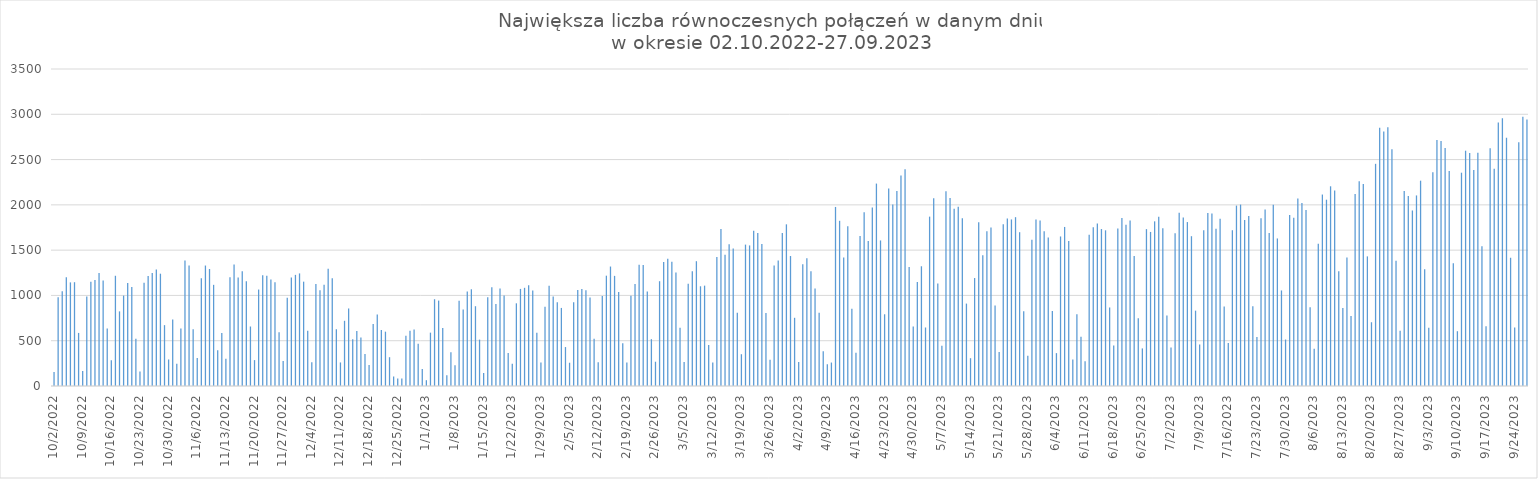
| Category | Max liczba połączeń |
|---|---|
| 10/2/22 | 155 |
| 10/3/22 | 980 |
| 10/4/22 | 1045 |
| 10/5/22 | 1201 |
| 10/6/22 | 1144 |
| 10/7/22 | 1146 |
| 10/8/22 | 586 |
| 10/9/22 | 166 |
| 10/10/22 | 988 |
| 10/11/22 | 1151 |
| 10/12/22 | 1169 |
| 10/13/22 | 1249 |
| 10/14/22 | 1166 |
| 10/15/22 | 634 |
| 10/16/22 | 284 |
| 10/17/22 | 1217 |
| 10/18/22 | 824 |
| 10/19/22 | 998 |
| 10/20/22 | 1138 |
| 10/21/22 | 1093 |
| 10/22/22 | 523 |
| 10/23/22 | 161 |
| 10/24/22 | 1141 |
| 10/25/22 | 1214 |
| 10/26/22 | 1249 |
| 10/27/22 | 1285 |
| 10/28/22 | 1240 |
| 10/29/22 | 672 |
| 10/30/22 | 293 |
| 10/31/22 | 735 |
| 11/1/22 | 247 |
| 11/2/22 | 634 |
| 11/3/22 | 1387 |
| 11/4/22 | 1331 |
| 11/5/22 | 626 |
| 11/6/22 | 309 |
| 11/7/22 | 1189 |
| 11/8/22 | 1330 |
| 11/9/22 | 1292 |
| 11/10/22 | 1117 |
| 11/11/22 | 394 |
| 11/12/22 | 586 |
| 11/13/22 | 301 |
| 11/14/22 | 1201 |
| 11/15/22 | 1342 |
| 11/16/22 | 1199 |
| 11/17/22 | 1266 |
| 11/18/22 | 1157 |
| 11/19/22 | 657 |
| 11/20/22 | 286 |
| 11/21/22 | 1065 |
| 11/22/22 | 1224 |
| 11/23/22 | 1217 |
| 11/24/22 | 1176 |
| 11/25/22 | 1145 |
| 11/26/22 | 593 |
| 11/27/22 | 275 |
| 11/28/22 | 973 |
| 11/29/22 | 1198 |
| 11/30/22 | 1227 |
| 12/1/22 | 1243 |
| 12/2/22 | 1152 |
| 12/3/22 | 610 |
| 12/4/22 | 262 |
| 12/5/22 | 1125 |
| 12/6/22 | 1056 |
| 12/7/22 | 1118 |
| 12/8/22 | 1295 |
| 12/9/22 | 1189 |
| 12/10/22 | 626 |
| 12/11/22 | 260 |
| 12/12/22 | 720 |
| 12/13/22 | 856 |
| 12/14/22 | 516 |
| 12/15/22 | 608 |
| 12/16/22 | 535 |
| 12/17/22 | 354 |
| 12/18/22 | 231 |
| 12/19/22 | 685 |
| 12/20/22 | 790 |
| 12/21/22 | 619 |
| 12/22/22 | 600 |
| 12/23/22 | 318 |
| 12/24/22 | 105 |
| 12/25/22 | 82 |
| 12/26/22 | 84 |
| 12/27/22 | 556 |
| 12/28/22 | 611 |
| 12/29/22 | 624 |
| 12/30/22 | 466 |
| 12/31/22 | 189 |
| 1/1/23 | 64 |
| 1/2/23 | 589 |
| 1/3/23 | 958 |
| 1/4/23 | 943 |
| 1/5/23 | 641 |
| 1/6/23 | 119 |
| 1/7/23 | 374 |
| 1/8/23 | 230 |
| 1/9/23 | 942 |
| 1/10/23 | 845 |
| 1/11/23 | 1043 |
| 1/12/23 | 1068 |
| 1/13/23 | 881 |
| 1/14/23 | 512 |
| 1/15/23 | 144 |
| 1/16/23 | 981 |
| 1/17/23 | 1091 |
| 1/18/23 | 904 |
| 1/19/23 | 1077 |
| 1/20/23 | 998 |
| 1/21/23 | 363 |
| 1/22/23 | 247 |
| 1/23/23 | 913 |
| 1/24/23 | 1072 |
| 1/25/23 | 1084 |
| 1/26/23 | 1112 |
| 1/27/23 | 1054 |
| 1/28/23 | 589 |
| 1/29/23 | 259 |
| 1/30/23 | 874 |
| 1/31/23 | 1108 |
| 2/1/23 | 989 |
| 2/2/23 | 926 |
| 2/3/23 | 862 |
| 2/4/23 | 430 |
| 2/5/23 | 257 |
| 2/6/23 | 925 |
| 2/7/23 | 1059 |
| 2/8/23 | 1070 |
| 2/9/23 | 1057 |
| 2/10/23 | 978 |
| 2/11/23 | 522 |
| 2/12/23 | 262 |
| 2/13/23 | 995 |
| 2/14/23 | 1218 |
| 2/15/23 | 1319 |
| 2/16/23 | 1216 |
| 2/17/23 | 1039 |
| 2/18/23 | 472 |
| 2/19/23 | 259 |
| 2/20/23 | 997 |
| 2/21/23 | 1126 |
| 2/22/23 | 1339 |
| 2/23/23 | 1335 |
| 2/24/23 | 1044 |
| 2/25/23 | 517 |
| 2/26/23 | 268 |
| 2/27/23 | 1157 |
| 2/28/23 | 1368 |
| 3/1/23 | 1405 |
| 3/2/23 | 1371 |
| 3/3/23 | 1253 |
| 3/4/23 | 642 |
| 3/5/23 | 266 |
| 3/6/23 | 1129 |
| 3/7/23 | 1268 |
| 3/8/23 | 1378 |
| 3/9/23 | 1101 |
| 3/10/23 | 1108 |
| 3/11/23 | 454 |
| 3/12/23 | 260 |
| 3/13/23 | 1425 |
| 3/14/23 | 1733 |
| 3/15/23 | 1450 |
| 3/16/23 | 1564 |
| 3/17/23 | 1519 |
| 3/18/23 | 809 |
| 3/19/23 | 351 |
| 3/20/23 | 1561 |
| 3/21/23 | 1552 |
| 3/22/23 | 1714 |
| 3/23/23 | 1688 |
| 3/24/23 | 1567 |
| 3/25/23 | 805 |
| 3/26/23 | 290 |
| 3/27/23 | 1330 |
| 3/28/23 | 1387 |
| 3/29/23 | 1688 |
| 3/30/23 | 1785 |
| 3/31/23 | 1435 |
| 4/1/23 | 753 |
| 4/2/23 | 266 |
| 4/3/23 | 1345 |
| 4/4/23 | 1411 |
| 4/5/23 | 1267 |
| 4/6/23 | 1076 |
| 4/7/23 | 809 |
| 4/8/23 | 383 |
| 4/9/23 | 240 |
| 4/10/23 | 259 |
| 4/11/23 | 1977 |
| 4/12/23 | 1824 |
| 4/13/23 | 1418 |
| 4/14/23 | 1765 |
| 4/15/23 | 853 |
| 4/16/23 | 366 |
| 4/17/23 | 1657 |
| 4/18/23 | 1919 |
| 4/19/23 | 1601 |
| 4/20/23 | 1972 |
| 4/21/23 | 2235 |
| 4/22/23 | 1607 |
| 4/23/23 | 792 |
| 4/24/23 | 2181 |
| 4/25/23 | 2004 |
| 4/26/23 | 2153 |
| 4/27/23 | 2323 |
| 4/28/23 | 2394 |
| 4/29/23 | 1315 |
| 4/30/23 | 658 |
| 5/1/23 | 1148 |
| 5/2/23 | 1322 |
| 5/3/23 | 646 |
| 5/4/23 | 1870 |
| 5/5/23 | 2072 |
| 5/6/23 | 1132 |
| 5/7/23 | 445 |
| 5/8/23 | 2150 |
| 5/9/23 | 2075 |
| 5/10/23 | 1957 |
| 5/11/23 | 1979 |
| 5/12/23 | 1851 |
| 5/13/23 | 910 |
| 5/14/23 | 307 |
| 5/15/23 | 1192 |
| 5/16/23 | 1808 |
| 5/17/23 | 1443 |
| 5/18/23 | 1708 |
| 5/19/23 | 1751 |
| 5/20/23 | 888 |
| 5/21/23 | 376 |
| 5/22/23 | 1786 |
| 5/23/23 | 1850 |
| 5/24/23 | 1839 |
| 5/25/23 | 1864 |
| 5/26/23 | 1698 |
| 5/27/23 | 825 |
| 5/28/23 | 333 |
| 5/29/23 | 1616 |
| 5/30/23 | 1838 |
| 5/31/23 | 1828 |
| 6/1/23 | 1708 |
| 6/2/23 | 1640 |
| 6/3/23 | 829 |
| 6/4/23 | 363 |
| 6/5/23 | 1651 |
| 6/6/23 | 1756 |
| 6/7/23 | 1600 |
| 6/8/23 | 293 |
| 6/9/23 | 793 |
| 6/10/23 | 544 |
| 6/11/23 | 274 |
| 6/12/23 | 1669 |
| 6/13/23 | 1752 |
| 6/14/23 | 1793 |
| 6/15/23 | 1733 |
| 6/16/23 | 1719 |
| 6/17/23 | 867 |
| 6/18/23 | 446 |
| 6/19/23 | 1738 |
| 6/20/23 | 1856 |
| 6/21/23 | 1781 |
| 6/22/23 | 1826 |
| 6/23/23 | 1435 |
| 6/24/23 | 749 |
| 6/25/23 | 415 |
| 6/26/23 | 1732 |
| 6/27/23 | 1701 |
| 6/28/23 | 1818 |
| 6/29/23 | 1869 |
| 6/30/23 | 1743 |
| 7/1/23 | 778 |
| 7/2/23 | 426 |
| 7/3/23 | 1687 |
| 7/4/23 | 1912 |
| 7/5/23 | 1861 |
| 7/6/23 | 1810 |
| 7/7/23 | 1654 |
| 7/8/23 | 832 |
| 7/9/23 | 458 |
| 7/10/23 | 1721 |
| 7/11/23 | 1910 |
| 7/12/23 | 1905 |
| 7/13/23 | 1735 |
| 7/14/23 | 1846 |
| 7/15/23 | 877 |
| 7/16/23 | 474 |
| 7/17/23 | 1720 |
| 7/18/23 | 1992 |
| 7/19/23 | 2003 |
| 7/20/23 | 1834 |
| 7/21/23 | 1878 |
| 7/22/23 | 881 |
| 7/23/23 | 540 |
| 7/24/23 | 1853 |
| 7/25/23 | 1948 |
| 7/26/23 | 1688 |
| 7/27/23 | 2000 |
| 7/28/23 | 1629 |
| 7/29/23 | 1055 |
| 7/30/23 | 513 |
| 7/31/23 | 1887 |
| 8/1/23 | 1859 |
| 8/2/23 | 2071 |
| 8/3/23 | 2021 |
| 8/4/23 | 1944 |
| 8/5/23 | 869 |
| 8/6/23 | 410 |
| 8/7/23 | 1570 |
| 8/8/23 | 2114 |
| 8/9/23 | 2057 |
| 8/10/23 | 2205 |
| 8/11/23 | 2158 |
| 8/12/23 | 1266 |
| 8/13/23 | 860 |
| 8/14/23 | 1418 |
| 8/15/23 | 774 |
| 8/16/23 | 2120 |
| 8/17/23 | 2260 |
| 8/18/23 | 2230 |
| 8/19/23 | 1431 |
| 8/20/23 | 704 |
| 8/21/23 | 2453 |
| 8/22/23 | 2852 |
| 8/23/23 | 2811 |
| 8/24/23 | 2858 |
| 8/25/23 | 2613 |
| 8/26/23 | 1383 |
| 8/27/23 | 611 |
| 8/28/23 | 2153 |
| 8/29/23 | 2099 |
| 8/30/23 | 1938 |
| 8/31/23 | 2104 |
| 9/1/23 | 2267 |
| 9/2/23 | 1288 |
| 9/3/23 | 642 |
| 9/4/23 | 2361 |
| 9/5/23 | 2715 |
| 9/6/23 | 2706 |
| 9/7/23 | 2629 |
| 9/8/23 | 2373 |
| 9/9/23 | 1354 |
| 9/10/23 | 605 |
| 9/11/23 | 2355 |
| 9/12/23 | 2598 |
| 9/13/23 | 2572 |
| 9/14/23 | 2384 |
| 9/15/23 | 2575 |
| 9/16/23 | 1542 |
| 9/17/23 | 660 |
| 9/18/23 | 2625 |
| 9/19/23 | 2399 |
| 9/20/23 | 2908 |
| 9/21/23 | 2956 |
| 9/22/23 | 2741 |
| 9/23/23 | 1416 |
| 9/24/23 | 647 |
| 9/25/23 | 2690 |
| 9/26/23 | 2973 |
| 9/27/23 | 2942 |